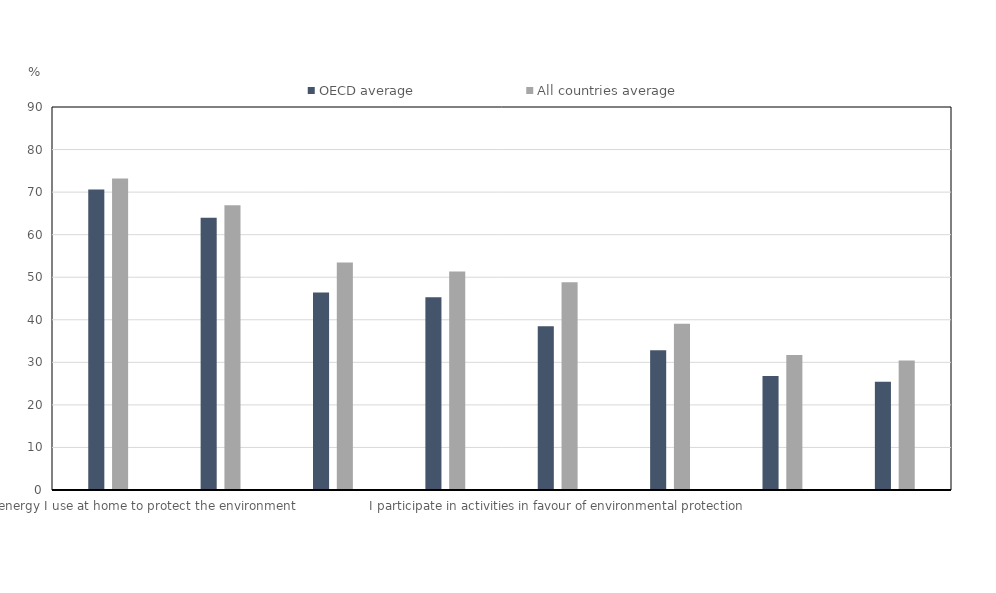
| Category | OECD average | All countries average |
|---|---|---|
| I reduce the energy I use at home to protect the environment | 70.596 | 73.221 |
| I keep myself informed about world events via <Twitter> or <Facebook> | 63.957 | 66.89 |
| I regularly read websites on international social issues (e.g. poverty, human rights) | 46.417 | 53.472 |
| I choose certain products for ethical or environmental reasons,
even if they are a bit more expensive | 45.316 | 51.315 |
| I participate in activities in favour of environmental protection | 38.492 | 48.797 |
| I participate in activities promoting equality between men and women | 32.819 | 39.083 |
| I boycott products or companies for political, ethical or environmental reasons | 26.792 | 31.717 |
| I sign environmental or social petitions on line | 25.415 | 30.454 |